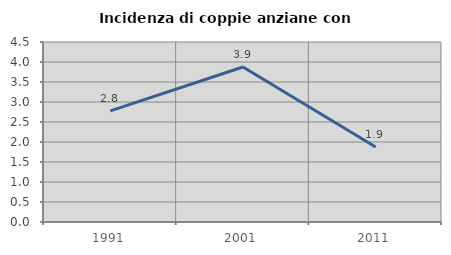
| Category | Incidenza di coppie anziane con figli |
|---|---|
| 1991.0 | 2.778 |
| 2001.0 | 3.876 |
| 2011.0 | 1.875 |